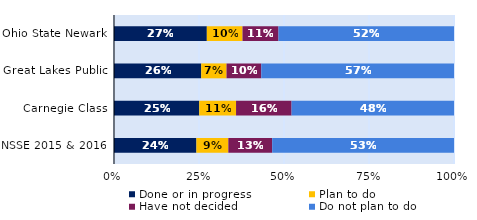
| Category | Done or in progress | Plan to do | Have not decided | Do not plan to do |
|---|---|---|---|---|
| Ohio State Newark | 0.273 | 0.105 | 0.106 | 0.516 |
| Great Lakes Public | 0.257 | 0.074 | 0.102 | 0.567 |
| Carnegie Class | 0.251 | 0.108 | 0.163 | 0.478 |
| NSSE 2015 & 2016 | 0.242 | 0.094 | 0.129 | 0.535 |